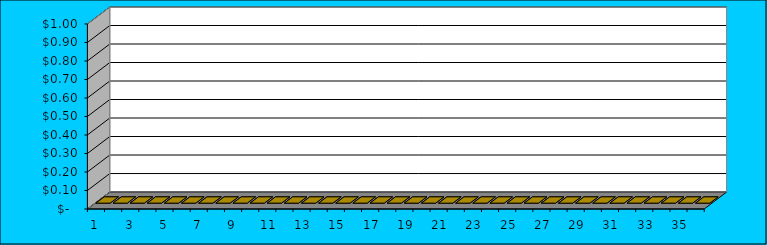
| Category | Series 0 |
|---|---|
| 0 | 0 |
| 1 | 0 |
| 2 | 0 |
| 3 | 0 |
| 4 | 0 |
| 5 | 0 |
| 6 | 0 |
| 7 | 0 |
| 8 | 0 |
| 9 | 0 |
| 10 | 0 |
| 11 | 0 |
| 12 | 0 |
| 13 | 0 |
| 14 | 0 |
| 15 | 0 |
| 16 | 0 |
| 17 | 0 |
| 18 | 0 |
| 19 | 0 |
| 20 | 0 |
| 21 | 0 |
| 22 | 0 |
| 23 | 0 |
| 24 | 0 |
| 25 | 0 |
| 26 | 0 |
| 27 | 0 |
| 28 | 0 |
| 29 | 0 |
| 30 | 0 |
| 31 | 0 |
| 32 | 0 |
| 33 | 0 |
| 34 | 0 |
| 35 | 0 |